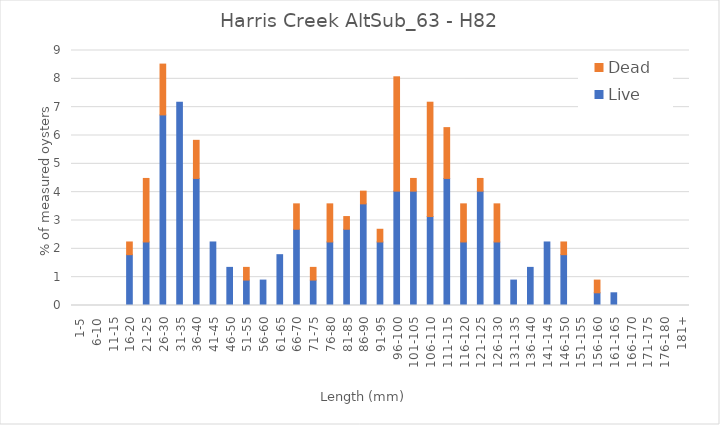
| Category | Live | Dead |
|---|---|---|
| 1-5 | 0 | 0 |
| 6-10 | 0 | 0 |
| 11-15 | 0 | 0 |
| 16-20 | 1.794 | 0.448 |
| 21-25 | 2.242 | 2.242 |
| 26-30 | 6.726 | 1.794 |
| 31-35 | 7.175 | 0 |
| 36-40 | 4.484 | 1.345 |
| 41-45 | 2.242 | 0 |
| 46-50 | 1.345 | 0 |
| 51-55 | 0.897 | 0.448 |
| 56-60 | 0.897 | 0 |
| 61-65 | 1.794 | 0 |
| 66-70 | 2.691 | 0.897 |
| 71-75 | 0.897 | 0.448 |
| 76-80 | 2.242 | 1.345 |
| 81-85 | 2.691 | 0.448 |
| 86-90 | 3.587 | 0.448 |
| 91-95 | 2.242 | 0.448 |
| 96-100 | 4.036 | 4.036 |
| 101-105 | 4.036 | 0.448 |
| 106-110 | 3.139 | 4.036 |
| 111-115 | 4.484 | 1.794 |
| 116-120 | 2.242 | 1.345 |
| 121-125 | 4.036 | 0.448 |
| 126-130 | 2.242 | 1.345 |
| 131-135 | 0.897 | 0 |
| 136-140 | 1.345 | 0 |
| 141-145 | 2.242 | 0 |
| 146-150 | 1.794 | 0.448 |
| 151-155 | 0 | 0 |
| 156-160 | 0.448 | 0.448 |
| 161-165 | 0.448 | 0 |
| 166-170 | 0 | 0 |
| 171-175 | 0 | 0 |
| 176-180 | 0 | 0 |
| 181+ | 0 | 0 |